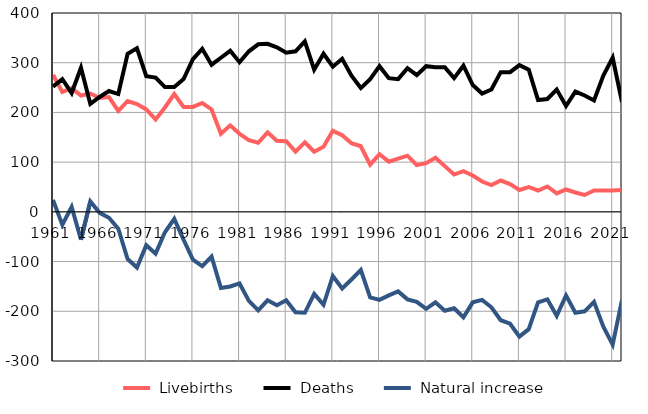
| Category |  Livebirths |  Deaths |  Natural increase |
|---|---|---|---|
| 1961.0 | 276 | 252 | 24 |
| 1962.0 | 241 | 267 | -26 |
| 1963.0 | 249 | 239 | 10 |
| 1964.0 | 234 | 290 | -56 |
| 1965.0 | 238 | 217 | 21 |
| 1966.0 | 229 | 231 | -2 |
| 1967.0 | 231 | 243 | -12 |
| 1968.0 | 203 | 237 | -34 |
| 1969.0 | 223 | 318 | -95 |
| 1970.0 | 217 | 329 | -112 |
| 1971.0 | 206 | 273 | -67 |
| 1972.0 | 186 | 270 | -84 |
| 1973.0 | 210 | 251 | -41 |
| 1974.0 | 237 | 251 | -14 |
| 1975.0 | 211 | 267 | -56 |
| 1976.0 | 211 | 307 | -96 |
| 1977.0 | 219 | 328 | -109 |
| 1978.0 | 206 | 296 | -90 |
| 1979.0 | 157 | 310 | -153 |
| 1980.0 | 174 | 324 | -150 |
| 1981.0 | 157 | 301 | -144 |
| 1982.0 | 144 | 323 | -179 |
| 1983.0 | 139 | 337 | -198 |
| 1984.0 | 160 | 338 | -178 |
| 1985.0 | 143 | 331 | -188 |
| 1986.0 | 142 | 320 | -178 |
| 1987.0 | 121 | 323 | -202 |
| 1988.0 | 140 | 343 | -203 |
| 1989.0 | 121 | 286 | -165 |
| 1990.0 | 131 | 318 | -187 |
| 1991.0 | 163 | 292 | -129 |
| 1992.0 | 154 | 308 | -154 |
| 1993.0 | 138 | 274 | -136 |
| 1994.0 | 132 | 249 | -117 |
| 1995.0 | 95 | 267 | -172 |
| 1996.0 | 116 | 293 | -177 |
| 1997.0 | 101 | 269 | -168 |
| 1998.0 | 107 | 267 | -160 |
| 1999.0 | 113 | 289 | -176 |
| 2000.0 | 94 | 275 | -181 |
| 2001.0 | 98 | 293 | -195 |
| 2002.0 | 109 | 291 | -182 |
| 2003.0 | 92 | 291 | -199 |
| 2004.0 | 75 | 269 | -194 |
| 2005.0 | 82 | 294 | -212 |
| 2006.0 | 73 | 255 | -182 |
| 2007.0 | 61 | 238 | -177 |
| 2008.0 | 54 | 246 | -192 |
| 2009.0 | 63 | 281 | -218 |
| 2010.0 | 56 | 281 | -225 |
| 2011.0 | 44 | 295 | -251 |
| 2012.0 | 50 | 286 | -236 |
| 2013.0 | 43 | 225 | -182 |
| 2014.0 | 51 | 227 | -176 |
| 2015.0 | 37 | 246 | -209 |
| 2016.0 | 45 | 213 | -168 |
| 2017.0 | 39 | 242 | -203 |
| 2018.0 | 34 | 234 | -200 |
| 2019.0 | 43 | 224 | -181 |
| 2020.0 | 43 | 274 | -231 |
| 2021.0 | 43 | 310 | -267 |
| 2022.0 | 44 | 221 | -177 |